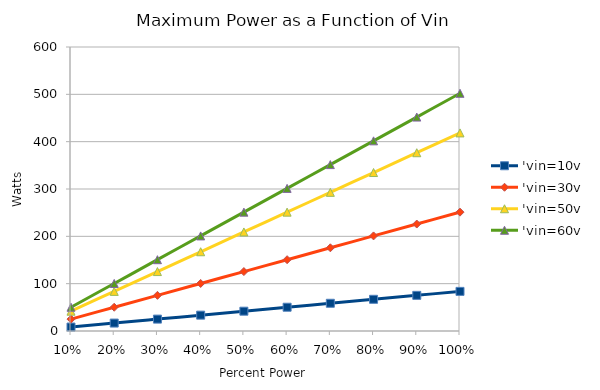
| Category | 'vin=10v | 'vin=30v | 'vin=50v | 'vin=60v |
|---|---|---|---|---|
| 0 | 8.37 | 25.11 | 41.85 | 50.22 |
| 1 | 16.74 | 50.22 | 83.7 | 100.44 |
| 2 | 25.11 | 75.33 | 125.55 | 150.66 |
| 3 | 33.48 | 100.44 | 167.4 | 200.88 |
| 4 | 41.85 | 125.55 | 209.25 | 251.1 |
| 5 | 50.22 | 150.66 | 251.1 | 301.32 |
| 6 | 58.59 | 175.77 | 292.95 | 351.54 |
| 7 | 66.96 | 200.88 | 334.8 | 401.76 |
| 8 | 75.33 | 225.99 | 376.65 | 451.98 |
| 9 | 83.7 | 251.1 | 418.5 | 502.2 |